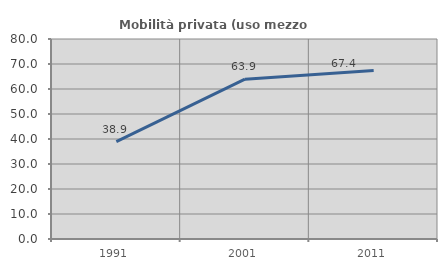
| Category | Mobilità privata (uso mezzo privato) |
|---|---|
| 1991.0 | 38.926 |
| 2001.0 | 63.946 |
| 2011.0 | 67.355 |